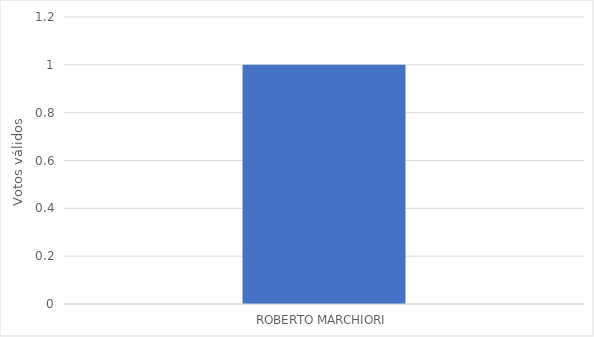
| Category | Series 0 |
|---|---|
| ROBERTO MARCHIORI | 1 |